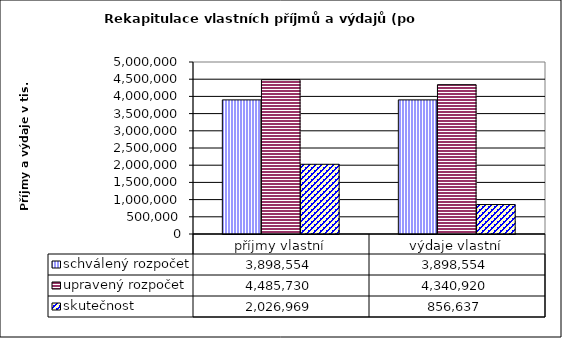
| Category | schválený rozpočet | upravený rozpočet | skutečnost |
|---|---|---|---|
| příjmy vlastní | 3898554 | 4485730 | 2026969 |
| výdaje vlastní | 3898554 | 4340920 | 856637 |